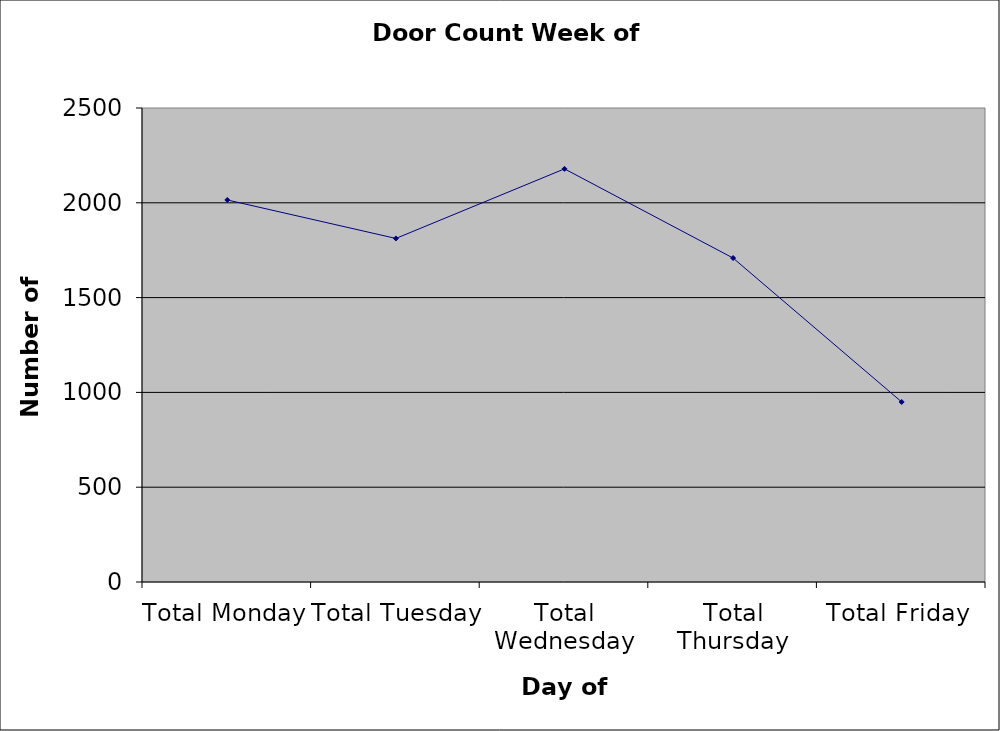
| Category | Series 0 |
|---|---|
| Total Monday | 2015 |
| Total Tuesday | 1812 |
| Total Wednesday | 2179 |
| Total Thursday | 1708.5 |
| Total Friday | 949.5 |